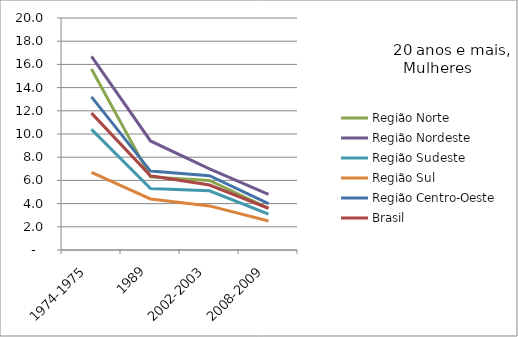
| Category | Região Norte | Região Nordeste | Região Sudeste | Região Sul | Região Centro-Oeste | Brasil |
|---|---|---|---|---|---|---|
| 1974-1975 | 15.6 | 16.7 | 10.4 | 6.7 | 13.2 | 11.8 |
| 1989 | 6.3 | 9.4 | 5.3 | 4.4 | 6.8 | 6.4 |
| 2002-2003 | 6 | 7 | 5.1 | 3.8 | 6.4 | 5.6 |
| 2008-2009 | 3.6 | 4.8 | 3.1 | 2.5 | 4 | 3.6 |